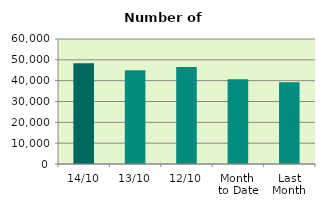
| Category | Series 0 |
|---|---|
| 14/10 | 48400 |
| 13/10 | 45038 |
| 12/10 | 46610 |
| Month 
to Date | 40654 |
| Last
Month | 39229.818 |